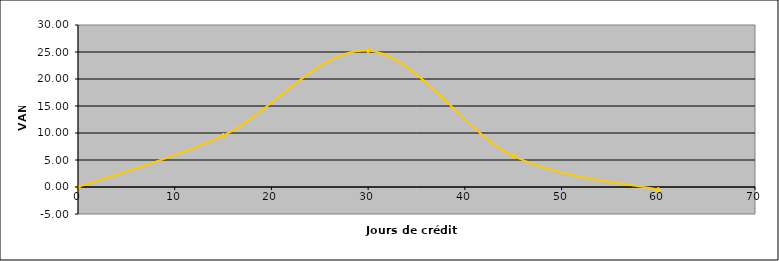
| Category | VAN |
|---|---|
| 0.0 | 0 |
| 15.0 | 9.522 |
| 30.0 | 25.26 |
| 45.0 | 5.751 |
| 60.0 | -0.468 |